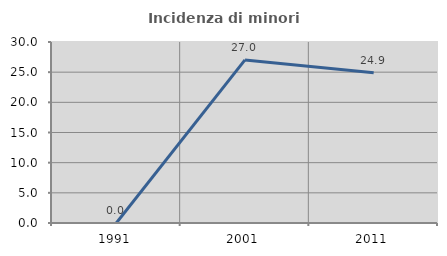
| Category | Incidenza di minori stranieri |
|---|---|
| 1991.0 | 0 |
| 2001.0 | 27.027 |
| 2011.0 | 24.903 |